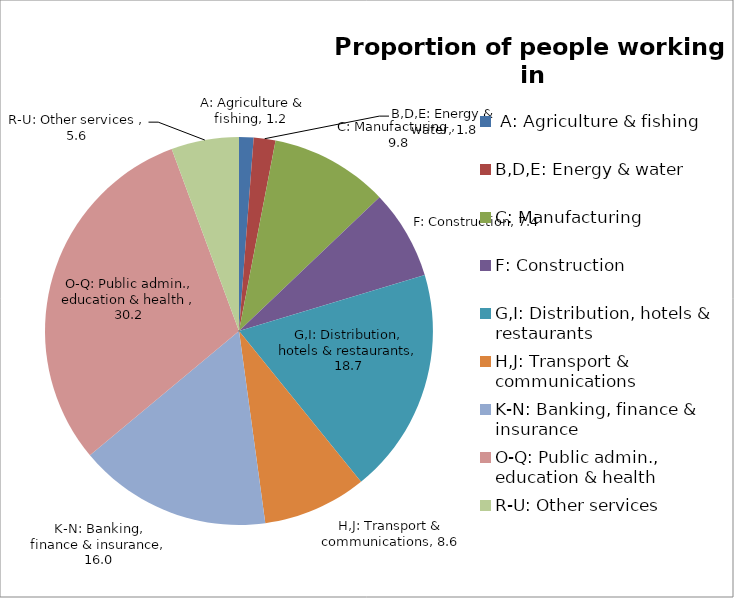
| Category | 2011 |
|---|---|
|  A: Agriculture & fishing | 1.2 |
| B,D,E: Energy & water | 1.8 |
| C: Manufacturing  | 9.8 |
| F: Construction | 7.4 |
| G,I: Distribution, hotels & restaurants | 18.7 |
| H,J: Transport & communications | 8.6 |
| K-N: Banking, finance & insurance | 16 |
| O-Q: Public admin., education & health  | 30.2 |
| R-U: Other services  | 5.6 |